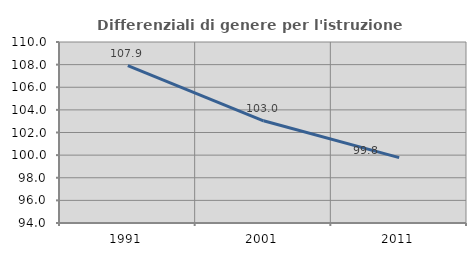
| Category | Differenziali di genere per l'istruzione superiore |
|---|---|
| 1991.0 | 107.904 |
| 2001.0 | 103.036 |
| 2011.0 | 99.778 |